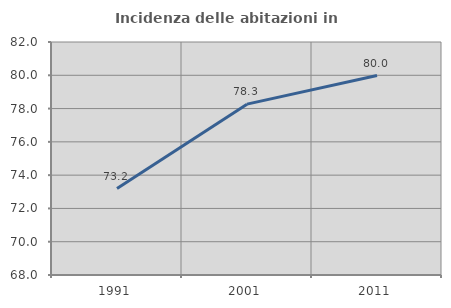
| Category | Incidenza delle abitazioni in proprietà  |
|---|---|
| 1991.0 | 73.193 |
| 2001.0 | 78.266 |
| 2011.0 | 79.983 |